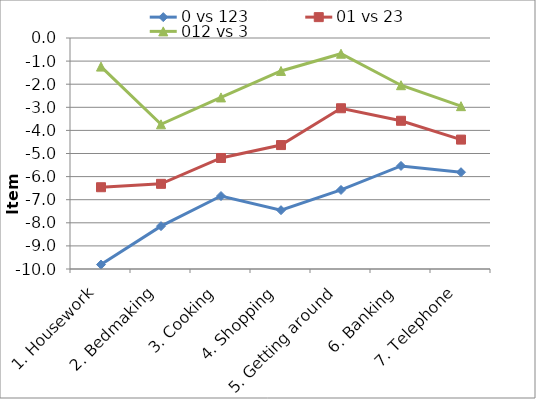
| Category | 0 vs 123 | 01 vs 23 | 012 vs 3 |
|---|---|---|---|
| 1. Housework | -9.808 | -6.46 | -1.238 |
| 2. Bedmaking | -8.145 | -6.313 | -3.737 |
| 3. Cooking | -6.841 | -5.194 | -2.572 |
| 4. Shopping | -7.454 | -4.635 | -1.426 |
| 5. Getting around | -6.578 | -3.041 | -0.681 |
| 6. Banking | -5.538 | -3.583 | -2.044 |
| 7. Telephone | -5.81 | -4.398 | -2.951 |